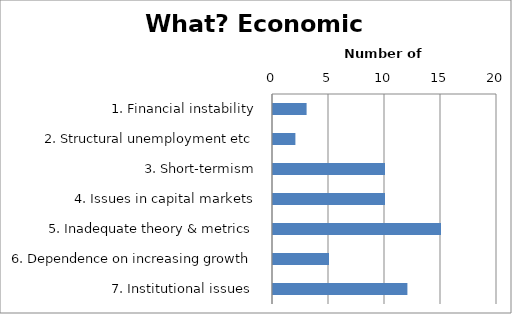
| Category | Series 0 |
|---|---|
| 1. Financial instability | 3 |
| 2. Structural unemployment etc | 2 |
| 3. Short-termism | 10 |
| 4. Issues in capital markets | 10 |
| 5. Inadequate theory & metrics | 15 |
| 6. Dependence on increasing growth | 5 |
| 7. Institutional issues  | 12 |